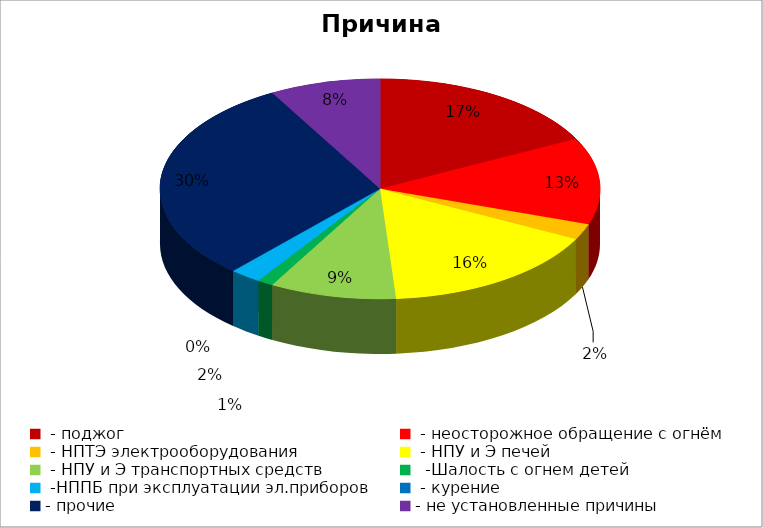
| Category | Причина пожара |
|---|---|
|  - поджог | 15 |
|  - неосторожное обращение с огнём | 11 |
|  - НПТЭ электрооборудования | 2 |
|  - НПУ и Э печей | 14 |
|  - НПУ и Э транспортных средств | 8 |
|   -Шалость с огнем детей | 1 |
|  -НППБ при эксплуатации эл.приборов | 2 |
|  - курение | 0 |
| - прочие | 26 |
| - не установленные причины | 7 |